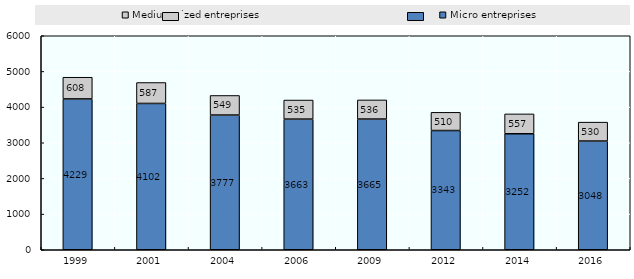
| Category | Micro entreprises | Medium-sized entreprises |
|---|---|---|
| 1999.0 | 4229 | 608 |
| 2001.0 | 4102 | 587 |
| 2004.0 | 3777 | 549 |
| 2006.0 | 3663 | 535 |
| 2009.0 | 3665 | 536 |
| 2012.0 | 3343 | 510 |
| 2014.0 | 3252 | 557 |
| 2016.0 | 3048 | 530 |